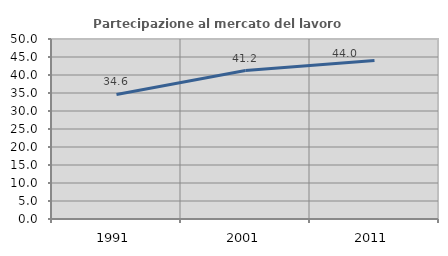
| Category | Partecipazione al mercato del lavoro  femminile |
|---|---|
| 1991.0 | 34.584 |
| 2001.0 | 41.227 |
| 2011.0 | 44.028 |